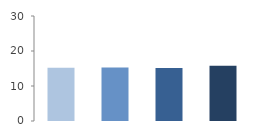
| Category | Rate (%) |
|---|---|
| 2009.0 | 15.244 |
| 2010.0 | 15.313 |
| 2011.0 | 15.126 |
| 2012.0 | 15.805 |